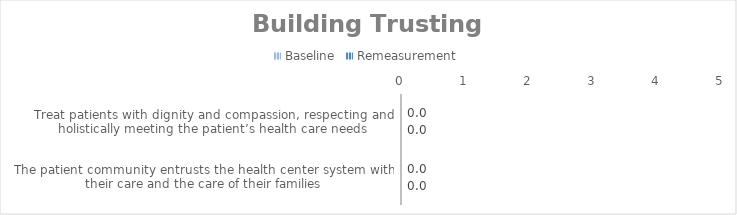
| Category | Baseline | Remeasurement |
|---|---|---|
| Treat patients with dignity and compassion, respecting and holistically meeting the patient’s health care needs | 0 | 0 |
| The patient community entrusts the health center system with their care and the care of their families | 0 | 0 |